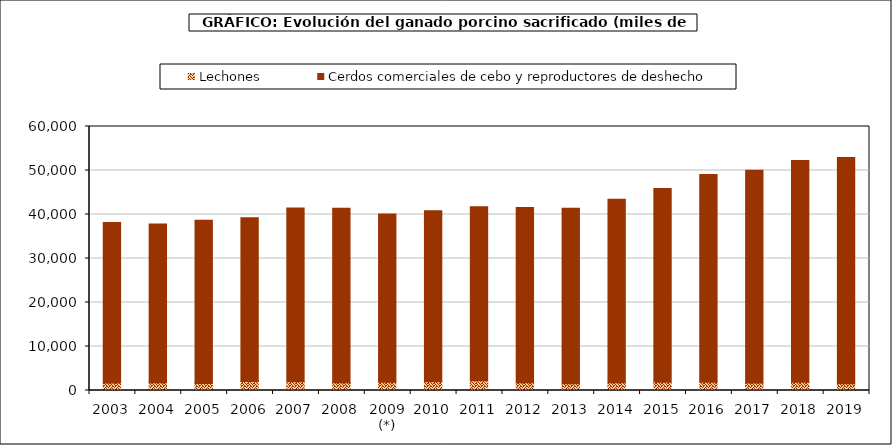
| Category | Lechones | Cerdos comerciales de cebo y reproductores de deshecho |
|---|---|---|
| 2003 | 1686.534 | 36493.566 |
| 2004 | 1763.831 | 36070.811 |
| 2005 | 1577 | 37128 |
| 2006 | 2022.902 | 37254.07 |
| 2007 | 1975.516 | 39513.029 |
| 2008 | 1749.619 | 39645.973 |
| 2009 (*) | 1874.979 | 38242.923 |
| 2010 | 1998.726 | 38848.29 |
| 2011 | 2197.864 | 39545.499 |
| 2012 | 1747.365 | 39847.191 |
| 2013 | 1527.256 | 39891.21 |
| 2014 | 1743.639 | 41739.934 |
| 2015 | 1882.976 | 44007.548 |
| 2016 | 1872.511 | 47211.274 |
| 2017 | 1728.098 | 48344.657 |
| 2018 | 1849.672 | 50439.528 |
| 2019 | 1555.988 | 51426.326 |